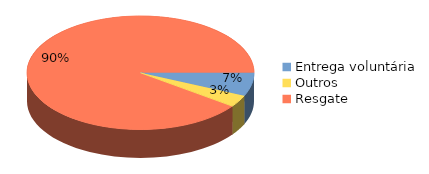
| Category | Series 0 |
|---|---|
| Entrega voluntária | 6.667 |
| Outros | 3.333 |
| Resgate | 90 |